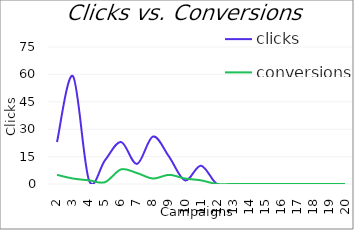
| Category | clicks | conversions |
|---|---|---|
| 2 | 23 | 5 |
| 3 | 59 | 3 |
| 4 | 2 | 2 |
| 5 | 13 | 1 |
| 6 | 23 | 8 |
| 7 | 11 | 6 |
| 8 | 26 | 3 |
| 9 | 15 | 5 |
| 10 | 2 | 3 |
| 11 | 10 | 2 |
| 12 | 0 | 0 |
| 13 | 0 | 0 |
| 14 | 0 | 0 |
| 15 | 0 | 0 |
| 16 | 0 | 0 |
| 17 | 0 | 0 |
| 18 | 0 | 0 |
| 19 | 0 | 0 |
| 20 | 0 | 0 |